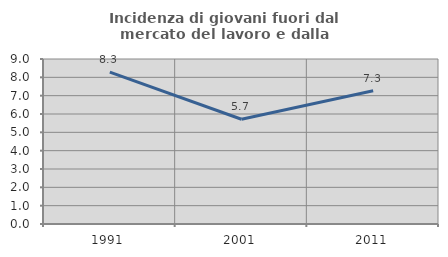
| Category | Incidenza di giovani fuori dal mercato del lavoro e dalla formazione  |
|---|---|
| 1991.0 | 8.284 |
| 2001.0 | 5.713 |
| 2011.0 | 7.266 |